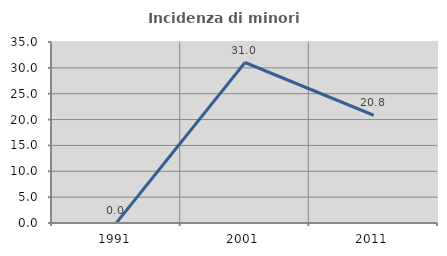
| Category | Incidenza di minori stranieri |
|---|---|
| 1991.0 | 0 |
| 2001.0 | 31.034 |
| 2011.0 | 20.833 |